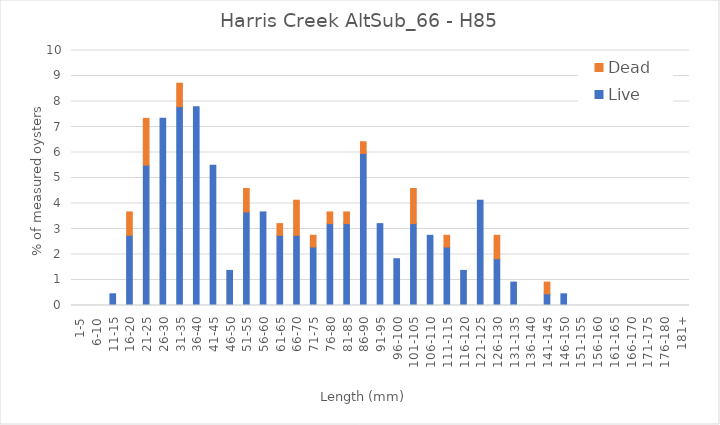
| Category | Live | Dead |
|---|---|---|
| 1-5 | 0 | 0 |
| 6-10 | 0 | 0 |
| 11-15 | 0.459 | 0 |
| 16-20 | 2.752 | 0.917 |
| 21-25 | 5.505 | 1.835 |
| 26-30 | 7.339 | 0 |
| 31-35 | 7.798 | 0.917 |
| 36-40 | 7.798 | 0 |
| 41-45 | 5.505 | 0 |
| 46-50 | 1.376 | 0 |
| 51-55 | 3.67 | 0.917 |
| 56-60 | 3.67 | 0 |
| 61-65 | 2.752 | 0.459 |
| 66-70 | 2.752 | 1.376 |
| 71-75 | 2.294 | 0.459 |
| 76-80 | 3.211 | 0.459 |
| 81-85 | 3.211 | 0.459 |
| 86-90 | 5.963 | 0.459 |
| 91-95 | 3.211 | 0 |
| 96-100 | 1.835 | 0 |
| 101-105 | 3.211 | 1.376 |
| 106-110 | 2.752 | 0 |
| 111-115 | 2.294 | 0.459 |
| 116-120 | 1.376 | 0 |
| 121-125 | 4.128 | 0 |
| 126-130 | 1.835 | 0.917 |
| 131-135 | 0.917 | 0 |
| 136-140 | 0 | 0 |
| 141-145 | 0.459 | 0.459 |
| 146-150 | 0.459 | 0 |
| 151-155 | 0 | 0 |
| 156-160 | 0 | 0 |
| 161-165 | 0 | 0 |
| 166-170 | 0 | 0 |
| 171-175 | 0 | 0 |
| 176-180 | 0 | 0 |
| 181+ | 0 | 0 |